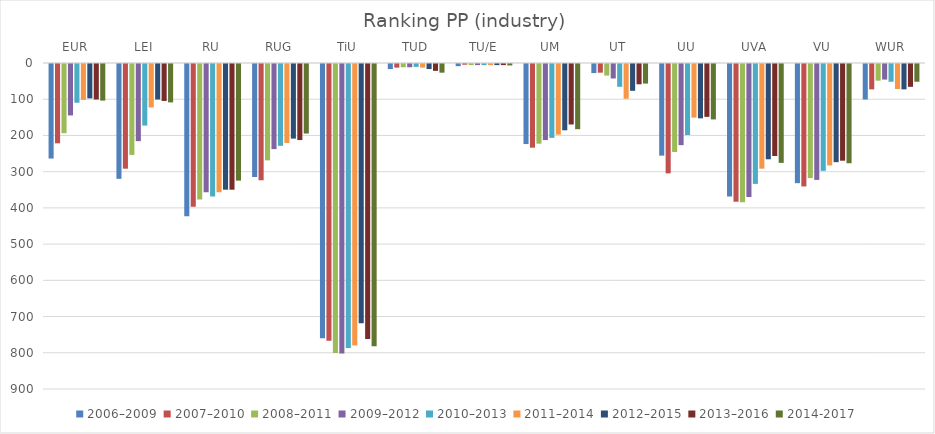
| Category | 2006–2009 | 2007–2010 | 2008–2011 | 2009–2012 | 2010–2013 | 2011–2014 | 2012–2015 | 2013–2016 | 2014-2017 |
|---|---|---|---|---|---|---|---|---|---|
| EUR | 261 | 219 | 191 | 142 | 107 | 99 | 95 | 98 | 101 |
| LEI | 317 | 289 | 251 | 213 | 170 | 120 | 98 | 102 | 106 |
| RU | 420 | 394 | 374 | 354 | 366 | 354 | 347 | 347 | 322 |
| RUG | 312 | 321 | 266 | 235 | 226 | 218 | 206 | 210 | 192 |
| TiU | 757 | 764 | 798 | 799 | 784 | 777 | 716 | 759 | 779 |
| TUD | 14 | 10 | 9 | 9 | 8 | 10 | 14 | 19 | 24 |
| TU/E | 6 | 2 | 3 | 3 | 3 | 3 | 3 | 3 | 4 |
| UM | 221 | 231 | 220 | 210 | 204 | 195 | 183 | 167 | 180 |
| UT | 25 | 24 | 32 | 40 | 63 | 96 | 74 | 56 | 54 |
| UU | 253 | 302 | 243 | 224 | 196 | 148 | 150 | 146 | 153 |
| UVA | 366 | 380 | 382 | 367 | 331 | 289 | 263 | 254 | 273 |
| VU | 329 | 338 | 315 | 320 | 295 | 280 | 271 | 267 | 274 |
| WUR | 98 | 70 | 46 | 43 | 49 | 69 | 70 | 63 | 49 |